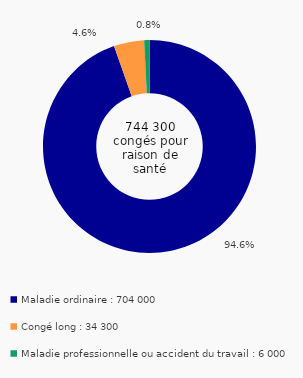
| Category | Series 0 |
|---|---|
| Maladie ordinaire : 704 000 | 0.946 |
| Congé long : 34 300 | 0.046 |
| Maladie professionnelle ou accident du travail : 6 000 | 0.008 |